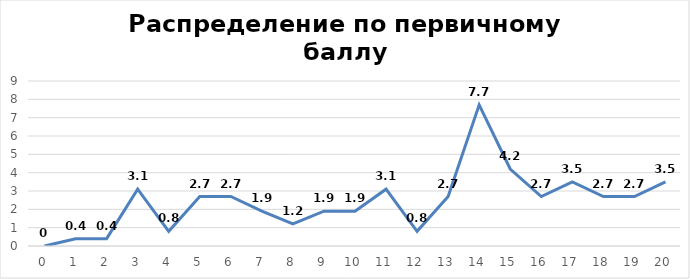
| Category | Распределение первичных баллов |
|---|---|
| 0.0 | 0 |
| 1.0 | 0.4 |
| 2.0 | 0.4 |
| 3.0 | 3.1 |
| 4.0 | 0.8 |
| 5.0 | 2.7 |
| 6.0 | 2.7 |
| 7.0 | 1.9 |
| 8.0 | 1.2 |
| 9.0 | 1.9 |
| 10.0 | 1.9 |
| 11.0 | 3.1 |
| 12.0 | 0.8 |
| 13.0 | 2.7 |
| 14.0 | 7.7 |
| 15.0 | 4.2 |
| 16.0 | 2.7 |
| 17.0 | 3.5 |
| 18.0 | 2.7 |
| 19.0 | 2.7 |
| 20.0 | 3.5 |